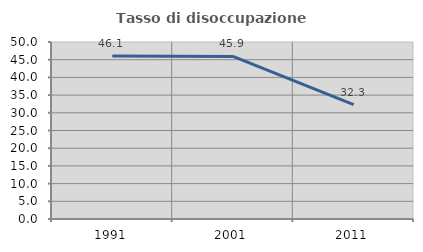
| Category | Tasso di disoccupazione giovanile  |
|---|---|
| 1991.0 | 46.053 |
| 2001.0 | 45.918 |
| 2011.0 | 32.308 |